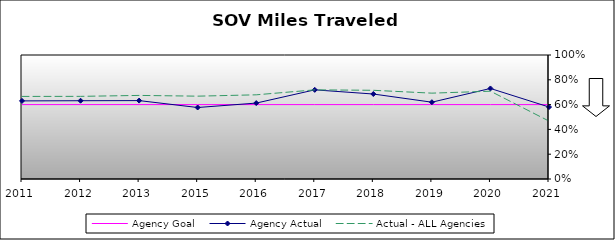
| Category | Agency Goal | Agency Actual | Actual - ALL Agencies |
|---|---|---|---|
| 2011.0 | 0.6 | 0.63 | 0.666 |
| 2012.0 | 0.6 | 0.631 | 0.666 |
| 2013.0 | 0.6 | 0.632 | 0.674 |
| 2015.0 | 0.6 | 0.577 | 0.668 |
| 2016.0 | 0.6 | 0.612 | 0.679 |
| 2017.0 | 0.6 | 0.719 | 0.719 |
| 2018.0 | 0.6 | 0.685 | 0.715 |
| 2019.0 | 0.6 | 0.619 | 0.692 |
| 2020.0 | 0.6 | 0.73 | 0.708 |
| 2021.0 | 0.6 | 0.58 | 0.467 |